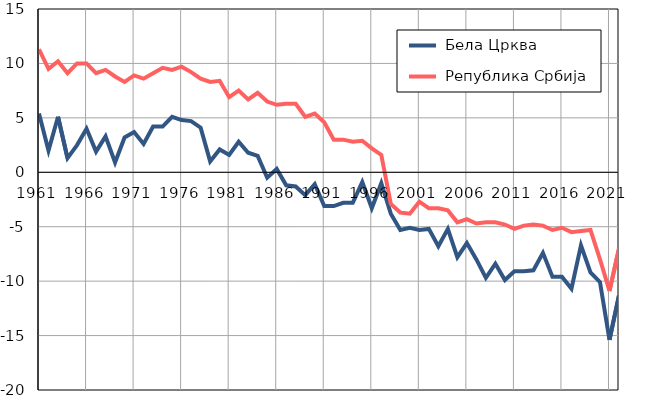
| Category |  Бела Црква |  Република Србија |
|---|---|---|
| 1961.0 | 5.4 | 11.3 |
| 1962.0 | 2 | 9.5 |
| 1963.0 | 5.1 | 10.2 |
| 1964.0 | 1.3 | 9.1 |
| 1965.0 | 2.5 | 10 |
| 1966.0 | 4 | 10 |
| 1967.0 | 1.9 | 9.1 |
| 1968.0 | 3.3 | 9.4 |
| 1969.0 | 0.9 | 8.8 |
| 1970.0 | 3.2 | 8.3 |
| 1971.0 | 3.7 | 8.9 |
| 1972.0 | 2.6 | 8.6 |
| 1973.0 | 4.2 | 9.1 |
| 1974.0 | 4.2 | 9.6 |
| 1975.0 | 5.1 | 9.4 |
| 1976.0 | 4.8 | 9.7 |
| 1977.0 | 4.7 | 9.2 |
| 1978.0 | 4.1 | 8.6 |
| 1979.0 | 1 | 8.3 |
| 1980.0 | 2.1 | 8.4 |
| 1981.0 | 1.6 | 6.9 |
| 1982.0 | 2.8 | 7.5 |
| 1983.0 | 1.8 | 6.7 |
| 1984.0 | 1.5 | 7.3 |
| 1985.0 | -0.5 | 6.5 |
| 1986.0 | 0.3 | 6.2 |
| 1987.0 | -1.2 | 6.3 |
| 1988.0 | -1.3 | 6.3 |
| 1989.0 | -2.1 | 5.1 |
| 1990.0 | -1.1 | 5.4 |
| 1991.0 | -3.1 | 4.6 |
| 1992.0 | -3.1 | 3 |
| 1993.0 | -2.8 | 3 |
| 1994.0 | -2.8 | 2.8 |
| 1995.0 | -0.9 | 2.9 |
| 1996.0 | -3.3 | 2.2 |
| 1997.0 | -1 | 1.6 |
| 1998.0 | -3.8 | -2.9 |
| 1999.0 | -5.3 | -3.7 |
| 2000.0 | -5.1 | -3.8 |
| 2001.0 | -5.3 | -2.7 |
| 2002.0 | -5.2 | -3.3 |
| 2003.0 | -6.8 | -3.3 |
| 2004.0 | -5.2 | -3.5 |
| 2005.0 | -7.8 | -4.6 |
| 2006.0 | -6.5 | -4.3 |
| 2007.0 | -8 | -4.7 |
| 2008.0 | -9.7 | -4.6 |
| 2009.0 | -8.4 | -4.6 |
| 2010.0 | -9.9 | -4.8 |
| 2011.0 | -9.1 | -5.2 |
| 2012.0 | -9.1 | -4.9 |
| 2013.0 | -9 | -4.8 |
| 2014.0 | -7.4 | -4.9 |
| 2015.0 | -9.6 | -5.3 |
| 2016.0 | -9.6 | -5.1 |
| 2017.0 | -10.7 | -5.5 |
| 2018.0 | -6.7 | -5.4 |
| 2019.0 | -9.2 | -5.3 |
| 2020.0 | -10.1 | -8 |
| 2021.0 | -15.4 | -10.9 |
| 2022.0 | -11.3 | -7 |